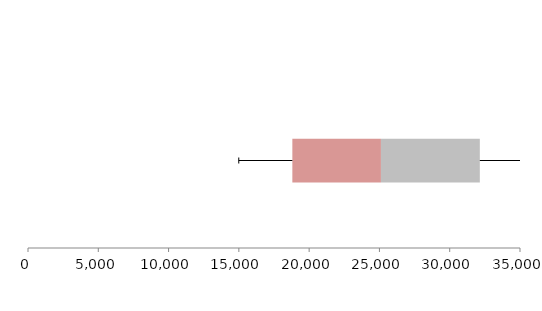
| Category | Series 1 | Series 2 | Series 3 |
|---|---|---|---|
| 0 | 18805.349 | 6302.793 | 7033.777 |